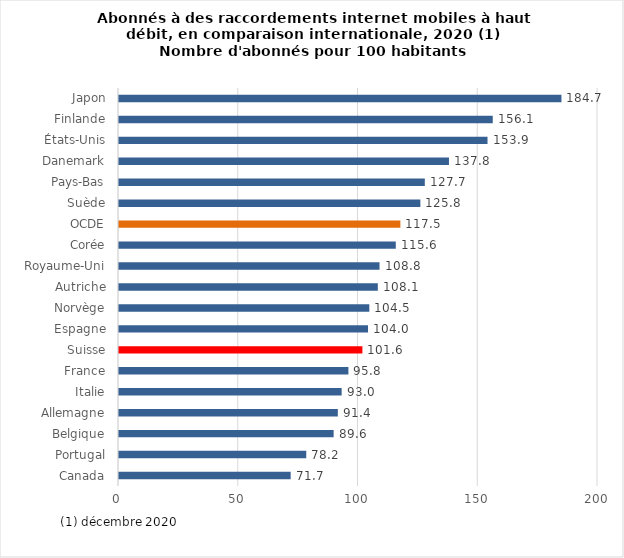
| Category | Series 0 |
|---|---|
| Canada | 71.68 |
| Portugal | 78.18 |
| Belgique | 89.62 |
| Allemagne | 91.37 |
| Italie | 92.97 |
| France | 95.78 |
| Suisse | 101.63 |
| Espagne | 103.97 |
| Norvège | 104.52 |
| Autriche | 108.07 |
| Royaume-Uni | 108.78 |
| Corée | 115.57 |
| OCDE | 117.48 |
| Suède | 125.83 |
| Pays-Bas | 127.69 |
| Danemark | 137.77 |
| États-Unis | 153.87 |
| Finlande | 156.06 |
| Japon | 184.74 |